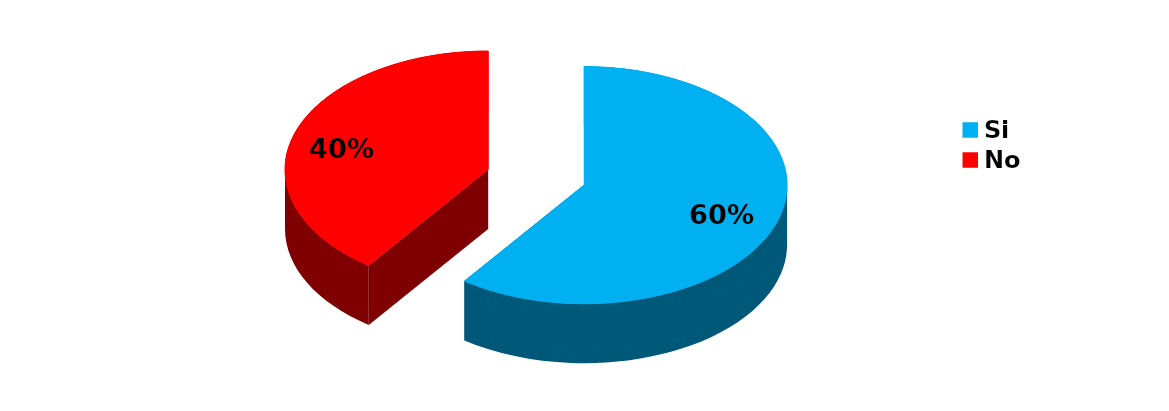
| Category | Series 0 |
|---|---|
| Si | 36 |
| No | 24 |